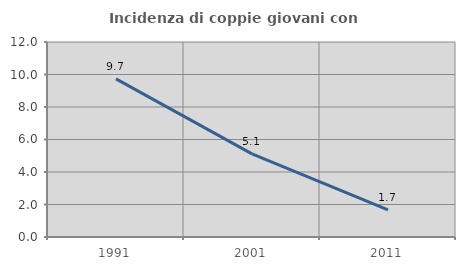
| Category | Incidenza di coppie giovani con figli |
|---|---|
| 1991.0 | 9.735 |
| 2001.0 | 5.116 |
| 2011.0 | 1.667 |